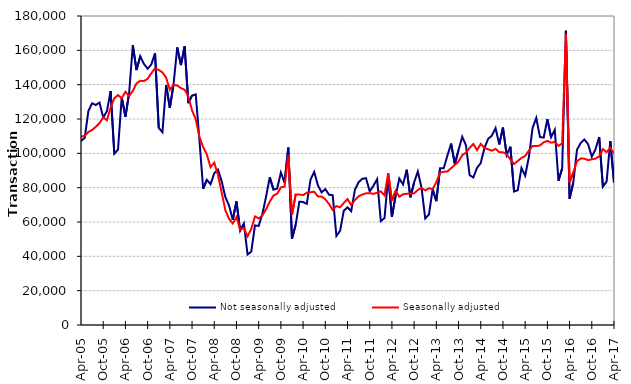
| Category | Not seasonally adjusted | Seasonally adjusted |
|---|---|---|
| 2005-04-01 | 107190 | 109680 |
| 2005-05-01 | 109010 | 110270 |
| 2005-06-01 | 124660 | 112460 |
| 2005-07-01 | 129170 | 113610 |
| 2005-08-01 | 128150 | 115470 |
| 2005-09-01 | 129560 | 117590 |
| 2005-10-01 | 120860 | 120990 |
| 2005-11-01 | 124540 | 119270 |
| 2005-12-01 | 136300 | 126640 |
| 2006-01-01 | 99740 | 132100 |
| 2006-02-01 | 102230 | 133940 |
| 2006-03-01 | 132710 | 132080 |
| 2006-04-01 | 121270 | 135880 |
| 2006-05-01 | 135030 | 133370 |
| 2006-06-01 | 162970 | 136400 |
| 2006-07-01 | 148490 | 140770 |
| 2006-08-01 | 156560 | 142280 |
| 2006-09-01 | 152100 | 142030 |
| 2006-10-01 | 149270 | 143440 |
| 2006-11-01 | 151770 | 146670 |
| 2006-12-01 | 158310 | 149510 |
| 2007-01-01 | 114880 | 148580 |
| 2007-02-01 | 112280 | 147120 |
| 2007-03-01 | 139780 | 144110 |
| 2007-04-01 | 126450 | 136980 |
| 2007-05-01 | 140110 | 139920 |
| 2007-06-01 | 161680 | 139530 |
| 2007-07-01 | 151390 | 137980 |
| 2007-08-01 | 162330 | 137040 |
| 2007-09-01 | 129210 | 133260 |
| 2007-10-01 | 133700 | 124980 |
| 2007-11-01 | 134320 | 119940 |
| 2007-12-01 | 107680 | 109440 |
| 2008-01-01 | 79350 | 103660 |
| 2008-02-01 | 84540 | 99300 |
| 2008-03-01 | 82050 | 91920 |
| 2008-04-01 | 88350 | 94610 |
| 2008-05-01 | 90570 | 87440 |
| 2008-06-01 | 83780 | 77280 |
| 2008-07-01 | 74560 | 66860 |
| 2008-08-01 | 69560 | 61820 |
| 2008-09-01 | 61330 | 59130 |
| 2008-10-01 | 72020 | 62890 |
| 2008-11-01 | 54910 | 55610 |
| 2008-12-01 | 59180 | 56400 |
| 2009-01-01 | 41060 | 51660 |
| 2009-02-01 | 42750 | 55930 |
| 2009-03-01 | 57990 | 63250 |
| 2009-04-01 | 57690 | 62120 |
| 2009-05-01 | 64640 | 63760 |
| 2009-06-01 | 74760 | 67390 |
| 2009-07-01 | 86090 | 71810 |
| 2009-08-01 | 78820 | 75400 |
| 2009-09-01 | 79480 | 76470 |
| 2009-10-01 | 88840 | 80170 |
| 2009-11-01 | 82910 | 80640 |
| 2009-12-01 | 103320 | 98940 |
| 2010-01-01 | 50230 | 64150 |
| 2010-02-01 | 58370 | 76080 |
| 2010-03-01 | 71830 | 76000 |
| 2010-04-01 | 71660 | 75660 |
| 2010-05-01 | 70560 | 77030 |
| 2010-06-01 | 84580 | 77340 |
| 2010-07-01 | 89190 | 77660 |
| 2010-08-01 | 81420 | 74890 |
| 2010-09-01 | 77250 | 74810 |
| 2010-10-01 | 79190 | 73240 |
| 2010-11-01 | 75890 | 70500 |
| 2010-12-01 | 75600 | 67070 |
| 2011-01-01 | 51900 | 69290 |
| 2011-02-01 | 54880 | 68570 |
| 2011-03-01 | 66600 | 71070 |
| 2011-04-01 | 68510 | 73380 |
| 2011-05-01 | 66340 | 69890 |
| 2011-06-01 | 78780 | 72760 |
| 2011-07-01 | 83180 | 74940 |
| 2011-08-01 | 85180 | 75990 |
| 2011-09-01 | 85530 | 76700 |
| 2011-10-01 | 77840 | 76770 |
| 2011-11-01 | 81110 | 76410 |
| 2011-12-01 | 84940 | 77050 |
| 2012-01-01 | 60530 | 77890 |
| 2012-02-01 | 62300 | 75500 |
| 2012-03-01 | 86720 | 88490 |
| 2012-04-01 | 63040 | 72390 |
| 2012-05-01 | 75350 | 78130 |
| 2012-06-01 | 85310 | 74730 |
| 2012-07-01 | 81880 | 76130 |
| 2012-08-01 | 90440 | 76450 |
| 2012-09-01 | 74390 | 76590 |
| 2012-10-01 | 83060 | 76690 |
| 2012-11-01 | 89450 | 78650 |
| 2012-12-01 | 80010 | 79820 |
| 2013-01-01 | 62060 | 78410 |
| 2013-02-01 | 64360 | 79640 |
| 2013-03-01 | 79000 | 79210 |
| 2013-04-01 | 72180 | 83160 |
| 2013-05-01 | 91270 | 88880 |
| 2013-06-01 | 91270 | 89250 |
| 2013-07-01 | 98710 | 89490 |
| 2013-08-01 | 105630 | 91350 |
| 2013-09-01 | 93680 | 93280 |
| 2013-10-01 | 101920 | 95210 |
| 2013-11-01 | 109670 | 98940 |
| 2013-12-01 | 104700 | 100410 |
| 2014-01-01 | 87280 | 103190 |
| 2014-02-01 | 85940 | 105450 |
| 2014-03-01 | 91570 | 101860 |
| 2014-04-01 | 94340 | 105510 |
| 2014-05-01 | 103110 | 103140 |
| 2014-06-01 | 108460 | 102360 |
| 2014-07-01 | 110280 | 101560 |
| 2014-08-01 | 114720 | 102640 |
| 2014-09-01 | 105170 | 100700 |
| 2014-10-01 | 114990 | 100570 |
| 2014-11-01 | 99010 | 99640 |
| 2014-12-01 | 103880 | 96320 |
| 2015-01-01 | 77750 | 93790 |
| 2015-02-01 | 78540 | 95540 |
| 2015-03-01 | 91490 | 97350 |
| 2015-04-01 | 86970 | 98450 |
| 2015-05-01 | 97800 | 101520 |
| 2015-06-01 | 114770 | 104220 |
| 2015-07-01 | 120610 | 104230 |
| 2015-08-01 | 109480 | 104590 |
| 2015-09-01 | 109160 | 106420 |
| 2015-10-01 | 119950 | 107260 |
| 2015-11-01 | 109370 | 106230 |
| 2015-12-01 | 113690 | 106590 |
| 2016-01-01 | 84030 | 104320 |
| 2016-02-01 | 91310 | 105780 |
| 2016-03-01 | 171370 | 169440 |
| 2016-04-01 | 73570 | 83050 |
| 2016-05-01 | 82980 | 88900 |
| 2016-06-01 | 102070 | 95450 |
| 2016-07-01 | 106020 | 96950 |
| 2016-08-01 | 108090 | 96910 |
| 2016-09-01 | 105360 | 95990 |
| 2016-10-01 | 98040 | 96520 |
| 2016-11-01 | 102390 | 96930 |
| 2016-12-01 | 109510 | 98260 |
| 2017-01-01 | 80620 | 102460 |
| 2017-02-01 | 83570 | 100680 |
| 2017-03-01 | 107090 | 103220 |
| 2017-04-01 | 83010 | 99910 |